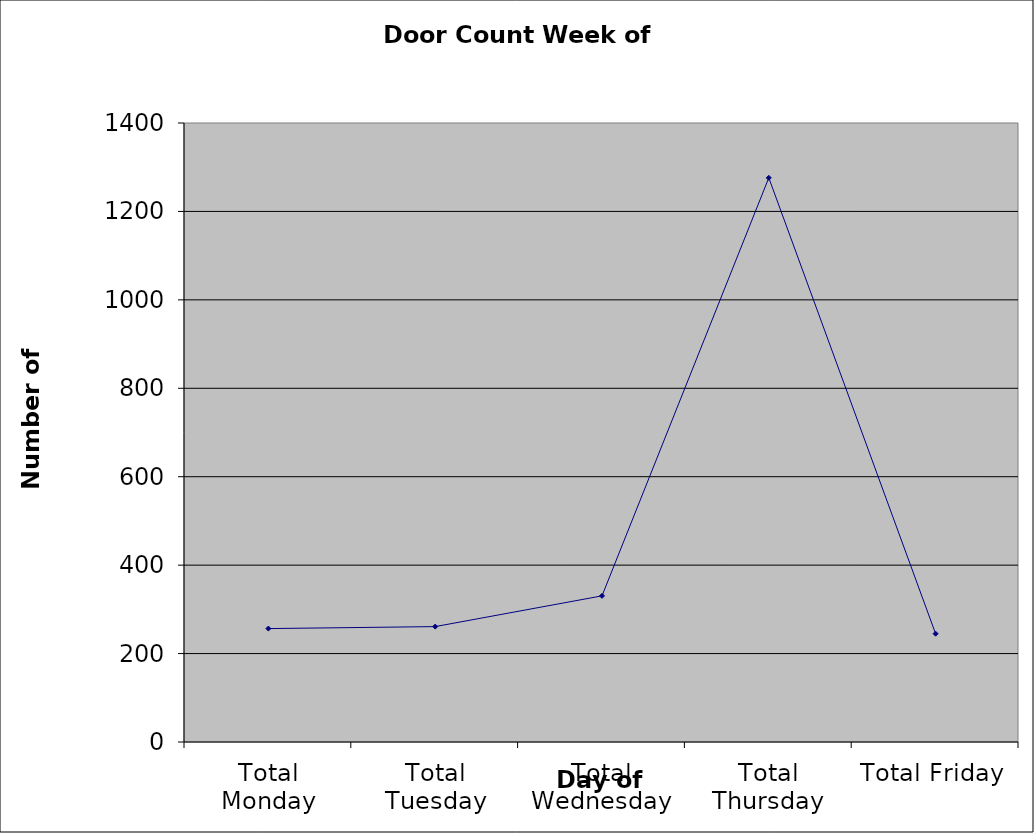
| Category | Series 0 |
|---|---|
| Total Monday | 256.5 |
| Total Tuesday | 261 |
| Total Wednesday | 330.5 |
| Total Thursday | 1276 |
| Total Friday | 245 |